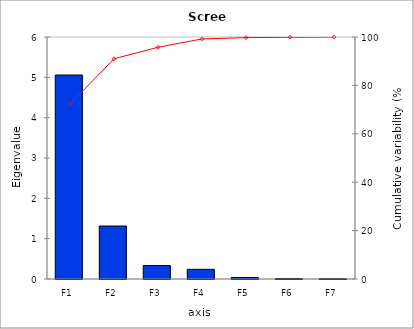
| Category | Eigenvalue |
|---|---|
| F1 | 5.057 |
| F2 | 1.313 |
| F3 | 0.333 |
| F4 | 0.24 |
| F5 | 0.038 |
| F6 | 0.012 |
| F7 | 0.007 |